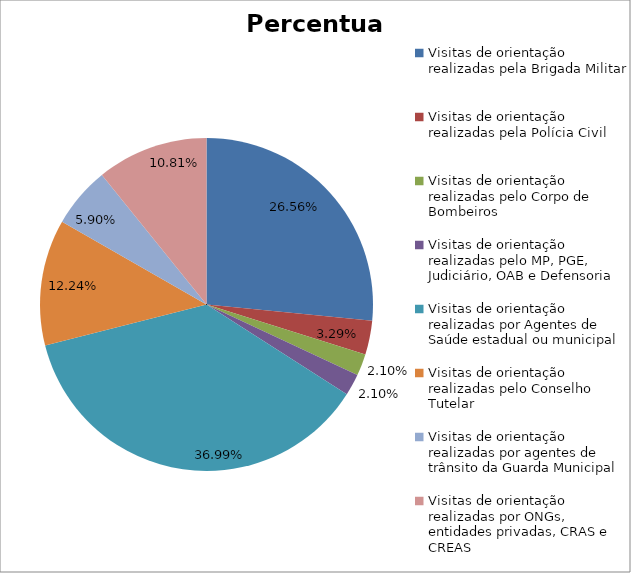
| Category | Percentual |
|---|---|
| Visitas de orientação realizadas pela Brigada Militar | 0.266 |
| Visitas de orientação realizadas pela Polícia Civil | 0.033 |
| Visitas de orientação realizadas pelo Corpo de Bombeiros | 0.021 |
| Visitas de orientação realizadas pelo MP, PGE, Judiciário, OAB e Defensoria | 0.021 |
| Visitas de orientação realizadas por Agentes de Saúde estadual ou municipal | 0.37 |
| Visitas de orientação realizadas pelo Conselho Tutelar | 0.122 |
| Visitas de orientação realizadas por agentes de trânsito da Guarda Municipal | 0.059 |
| Visitas de orientação realizadas por ONGs, entidades privadas, CRAS e CREAS | 0.108 |